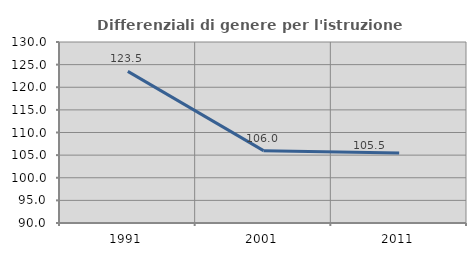
| Category | Differenziali di genere per l'istruzione superiore |
|---|---|
| 1991.0 | 123.507 |
| 2001.0 | 105.986 |
| 2011.0 | 105.479 |